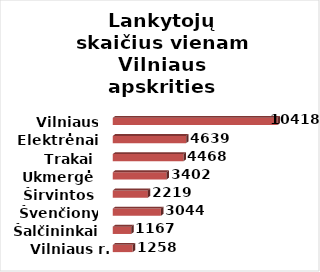
| Category | Series 0 |
|---|---|
| Vilniaus r. | 1258 |
| Šalčininkai | 1167 |
| Švenčionys | 3044 |
| Širvintos | 2219 |
| Ukmergė | 3402 |
| Trakai | 4468 |
| Elektrėnai | 4639 |
| Vilniaus m. | 10418 |